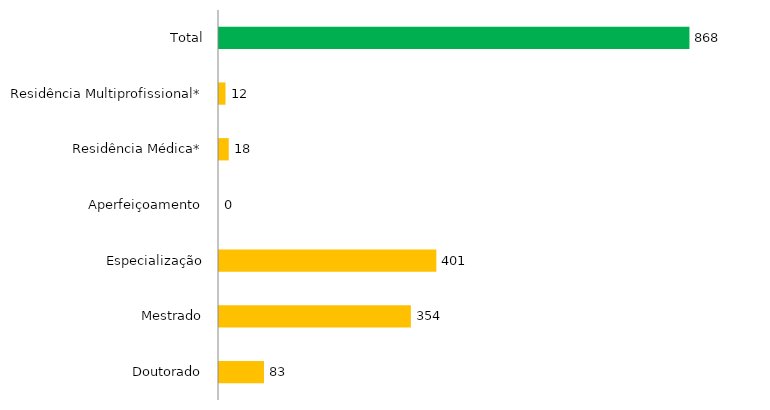
| Category | Pós - Gradução UFGD |
|---|---|
| Doutorado | 83 |
| Mestrado | 354 |
| Especialização | 401 |
| Aperfeiçoamento | 0 |
| Residência Médica* | 18 |
| Residência Multiprofissional* | 12 |
| Total | 868 |